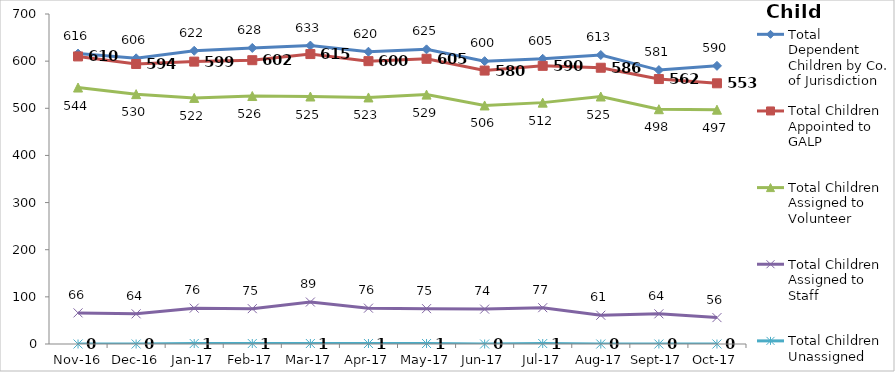
| Category | Total Dependent Children by Co. of Jurisdiction | Total Children Appointed to GALP | Total Children Assigned to Volunteer | Total Children Assigned to Staff | Total Children Unassigned |
|---|---|---|---|---|---|
| 2016-11-01 | 616 | 610 | 544 | 66 | 0 |
| 2016-12-01 | 606 | 594 | 530 | 64 | 0 |
| 2017-01-01 | 622 | 599 | 522 | 76 | 1 |
| 2017-02-01 | 628 | 602 | 526 | 75 | 1 |
| 2017-03-01 | 633 | 615 | 525 | 89 | 1 |
| 2017-04-01 | 620 | 600 | 523 | 76 | 1 |
| 2017-05-01 | 625 | 605 | 529 | 75 | 1 |
| 2017-06-01 | 600 | 580 | 506 | 74 | 0 |
| 2017-07-01 | 605 | 590 | 512 | 77 | 1 |
| 2017-08-01 | 613 | 586 | 525 | 61 | 0 |
| 2017-09-01 | 581 | 562 | 498 | 64 | 0 |
| 2017-10-01 | 590 | 553 | 497 | 56 | 0 |